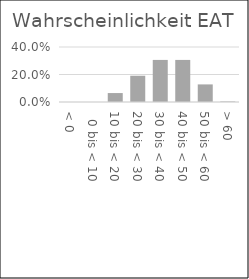
| Category | Wahrsch. |
|---|---|
| < 0 | 0 |
|   0 bis < 10 | 0 |
| 10 bis < 20 | 0.065 |
| 20 bis < 30 | 0.191 |
| 30 bis < 40 | 0.306 |
| 40 bis < 50 | 0.306 |
| 50 bis < 60 | 0.128 |
| > 60 | 0.004 |